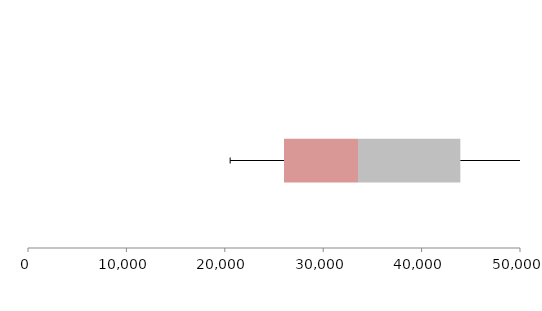
| Category | Series 1 | Series 2 | Series 3 |
|---|---|---|---|
| 0 | 26018.716 | 7519.191 | 10398.509 |